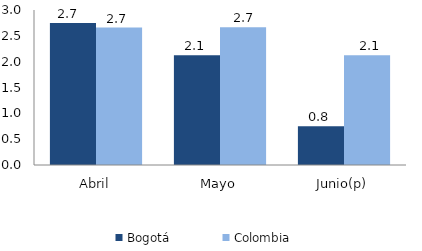
| Category | Bogotá | Colombia |
|---|---|---|
| Abril | 2.748 | 2.66 |
| Mayo | 2.124 | 2.664 |
| Junio(p) | 0.752 | 2.125 |